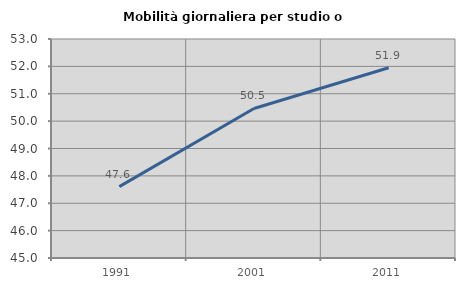
| Category | Mobilità giornaliera per studio o lavoro |
|---|---|
| 1991.0 | 47.607 |
| 2001.0 | 50.463 |
| 2011.0 | 51.948 |